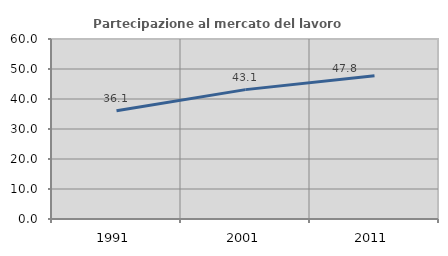
| Category | Partecipazione al mercato del lavoro  femminile |
|---|---|
| 1991.0 | 36.067 |
| 2001.0 | 43.128 |
| 2011.0 | 47.766 |